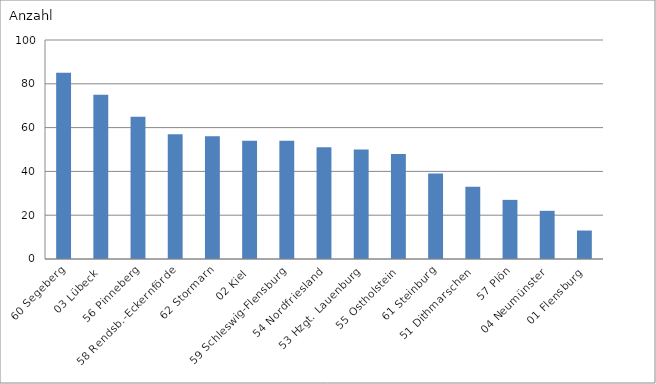
| Category | 60 Segeberg |
|---|---|
| 60 Segeberg | 85 |
| 03 Lübeck | 75 |
| 56 Pinneberg | 65 |
| 58 Rendsb.-Eckernförde | 57 |
| 62 Stormarn | 56 |
| 02 Kiel | 54 |
| 59 Schleswig-Flensburg | 54 |
| 54 Nordfriesland | 51 |
| 53 Hzgt. Lauenburg | 50 |
| 55 Ostholstein | 48 |
| 61 Steinburg | 39 |
| 51 Dithmarschen | 33 |
| 57 Plön | 27 |
| 04 Neumünster | 22 |
| 01 Flensburg | 13 |